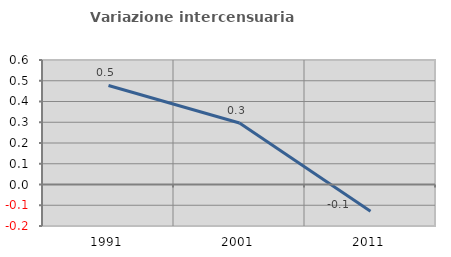
| Category | Variazione intercensuaria annua |
|---|---|
| 1991.0 | 0.477 |
| 2001.0 | 0.297 |
| 2011.0 | -0.128 |